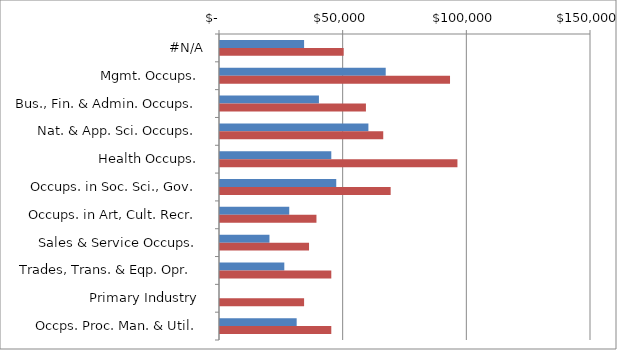
| Category | Series 0 | Series 1 |
|---|---|---|
|  #N/A  | 34000 | 50000 |
|  Mgmt. Occups.  | 67000 | 93000 |
|  Bus., Fin. & Admin. Occups.  | 40000 | 59000 |
|  Nat. & App. Sci. Occups.  | 60000 | 66000 |
|  Health Occups.  | 45000 | 96000 |
|  Occups. in Soc. Sci., Gov.  | 47000 | 69000 |
|  Occups. in Art, Cult. Recr.  | 28000 | 39000 |
|  Sales & Service Occups.  | 20000 | 36000 |
|  Trades, Trans. & Eqp. Opr.   | 26000 | 45000 |
|  Primary Industry  | 0 | 34000 |
|  Occps. Proc. Man. & Util.  | 31000 | 45000 |